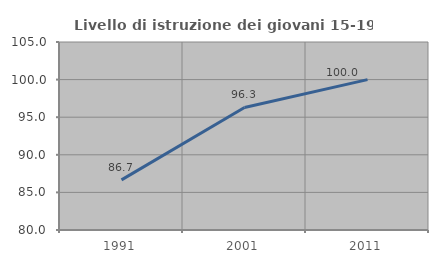
| Category | Livello di istruzione dei giovani 15-19 anni |
|---|---|
| 1991.0 | 86.667 |
| 2001.0 | 96.296 |
| 2011.0 | 100 |